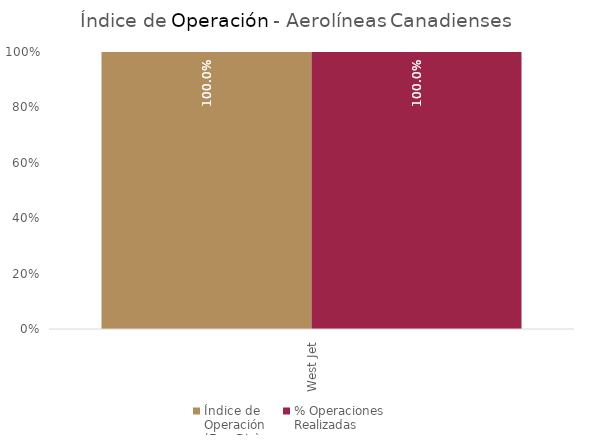
| Category | Índice de 
Operación
(Ene-Dic) | % Operaciones
Realizadas |
|---|---|---|
| West Jet | 1 | 1 |